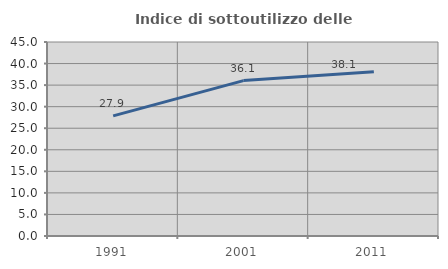
| Category | Indice di sottoutilizzo delle abitazioni  |
|---|---|
| 1991.0 | 27.856 |
| 2001.0 | 36.052 |
| 2011.0 | 38.115 |